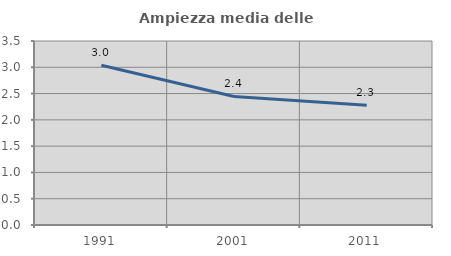
| Category | Ampiezza media delle famiglie |
|---|---|
| 1991.0 | 3.037 |
| 2001.0 | 2.445 |
| 2011.0 | 2.277 |